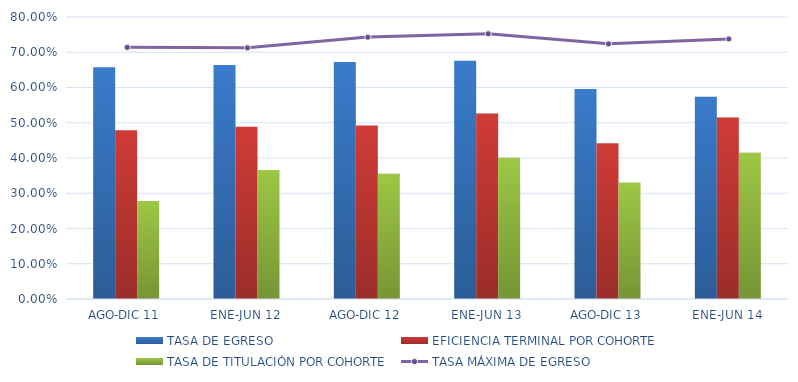
| Category | TASA DE EGRESO | EFICIENCIA TERMINAL POR COHORTE | TASA DE TITULACIÓN POR COHORTE |
|---|---|---|---|
| AGO-DIC 11 | 0.657 | 0.478 | 0.278 |
| ENE-JUN 12 | 0.664 | 0.489 | 0.366 |
| AGO-DIC 12 | 0.672 | 0.492 | 0.355 |
| ENE-JUN 13 | 0.676 | 0.526 | 0.401 |
| AGO-DIC 13 | 0.596 | 0.442 | 0.331 |
| ENE-JUN 14 | 0.574 | 0.515 | 0.415 |